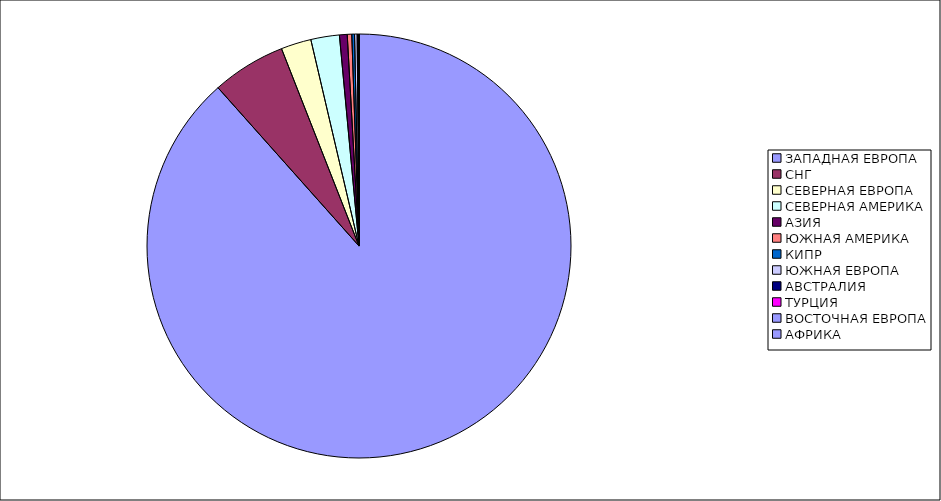
| Category | Оборот |
|---|---|
| ЗАПАДНАЯ ЕВРОПА | 0.884 |
| СНГ | 0.056 |
| СЕВЕРНАЯ ЕВРОПА | 0.023 |
| СЕВЕРНАЯ АМЕРИКА | 0.022 |
| АЗИЯ | 0.006 |
| ЮЖНАЯ АМЕРИКА | 0.003 |
| КИПР | 0.002 |
| ЮЖНАЯ ЕВРОПА | 0.002 |
| АВСТРАЛИЯ | 0.001 |
| ТУРЦИЯ | 0.001 |
| ВОСТОЧНАЯ ЕВРОПА | 0 |
| АФРИКА | 0 |